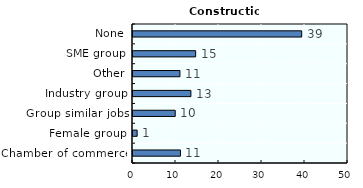
| Category | Construction |
|---|---|
| Chamber of commerce | 11.035 |
| Female group | 0.966 |
| Group similar jobs | 9.819 |
| Industry group | 13.464 |
| Other | 10.918 |
| SME group | 14.568 |
| None | 39.231 |